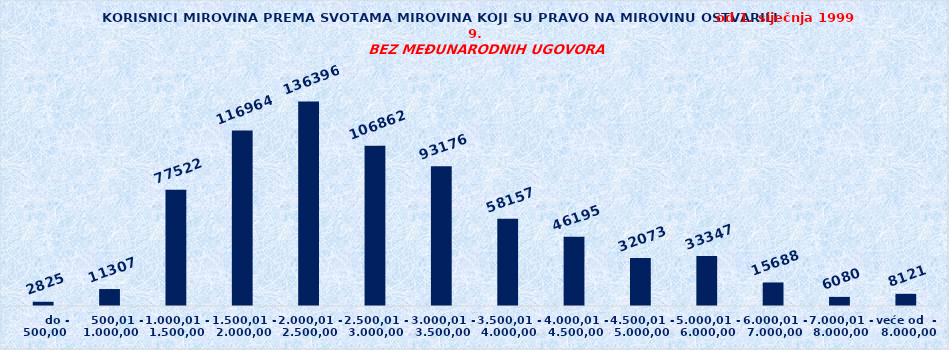
| Category | Series 0 |
|---|---|
|       do - 500,00 | 2825 |
|    500,01 - 1.000,00 | 11307 |
| 1.000,01 - 1.500,00 | 77522 |
| 1.500,01 - 2.000,00 | 116964 |
| 2.000,01 - 2.500,00 | 136396 |
| 2.500,01 - 3.000,00 | 106862 |
| 3.000,01 - 3.500,00 | 93176 |
| 3.500,01 - 4.000,00 | 58157 |
| 4.000,01 - 4.500,00 | 46195 |
| 4.500,01 - 5.000,00 | 32073 |
| 5.000,01 - 6.000,00 | 33347 |
| 6.000,01 - 7.000,00 | 15688 |
| 7.000,01 - 8.000,00 | 6080 |
| veće od  -  8.000,00 | 8121 |